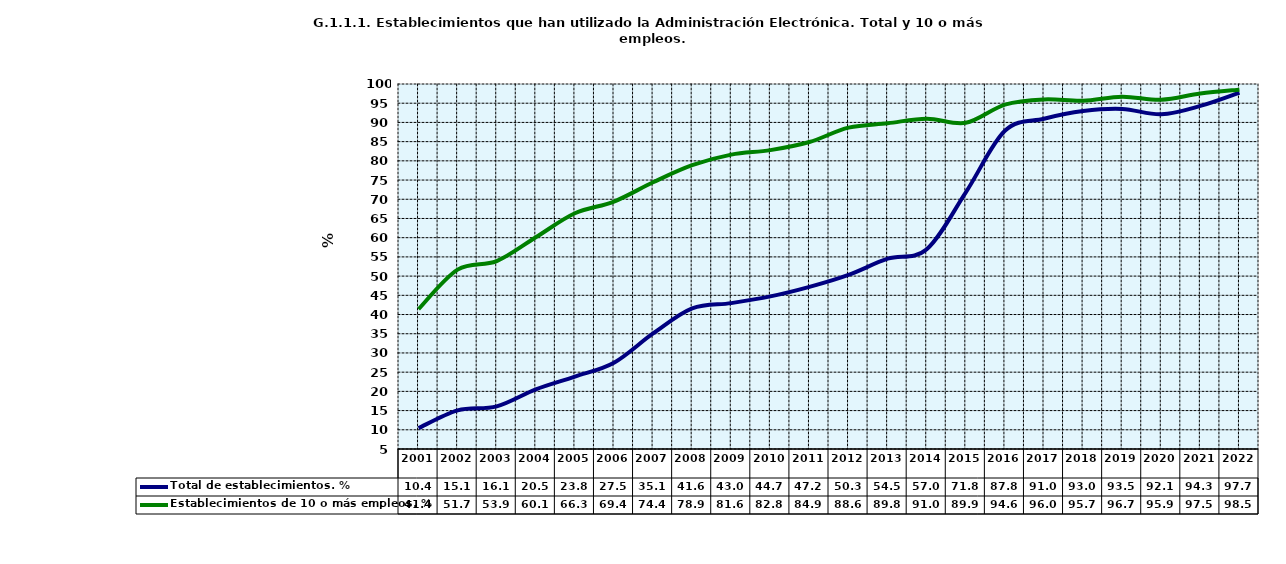
| Category | Total de establecimientos. % | Establecimientos de 10 o más empleos. % |
|---|---|---|
| 2001.0 | 10.421 | 41.411 |
| 2002.0 | 15.068 | 51.694 |
| 2003.0 | 16.098 | 53.904 |
| 2004.0 | 20.515 | 60.107 |
| 2005.0 | 23.837 | 66.349 |
| 2006.0 | 27.46 | 69.402 |
| 2007.0 | 35.078 | 74.42 |
| 2008.0 | 41.612 | 78.862 |
| 2009.0 | 42.972 | 81.627 |
| 2010.0 | 44.715 | 82.794 |
| 2011.0 | 47.2 | 84.9 |
| 2012.0 | 50.321 | 88.639 |
| 2013.0 | 54.524 | 89.774 |
| 2014.0 | 56.986 | 90.972 |
| 2015.0 | 71.8 | 89.9 |
| 2016.0 | 87.813 | 94.63 |
| 2017.0 | 90.959 | 95.981 |
| 2018.0 | 92.961 | 95.655 |
| 2019.0 | 93.517 | 96.71 |
| 2020.0 | 92.114 | 95.9 |
| 2021.0 | 94.294 | 97.529 |
| 2022.0 | 97.747 | 98.531 |